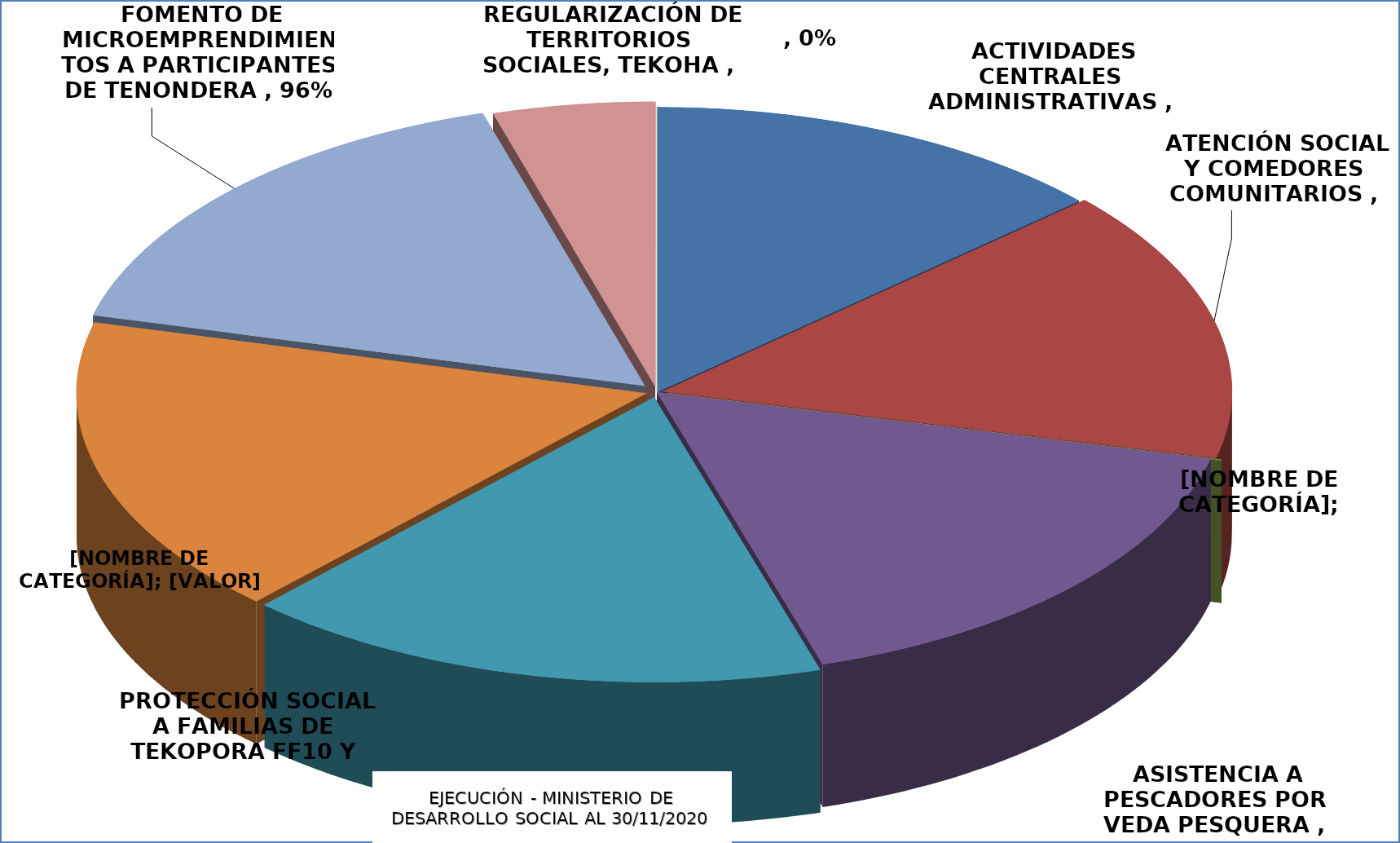
| Category | EJECUCIÓN - MINISTERIO DE DESARROLLO SOCIAL |
|---|---|
| ACTIVIDADES CENTRALES ADMINISTRATIVAS | 0.781 |
| ATENCIÓN SOCIAL Y COMEDORES COMUNITARIOS | 0.91 |
| ATENCIÓN SOCIAL Y COMEDORES COMUNITARIOS - OLLAS POPULARES -FF20 - OF 817 - COVID19 - ADICIONAL | 0 |
| ASISTENCIA A PESCADORES POR VEDA PESQUERA | 0.972 |
| PROTECCIÓN SOCIAL A FAMILIAS DE TEKOPORA FF10 Y FF20 | 0.982 |
| TRAN. MONETARIAS A FAMILIAS AFECTADAS POR COVID19- ADICIONAL | 1 |
| FOMENTO DE MICROEMPRENDIMIENTOS A PARTICIPANTES DE TENONDERA | 0.964 |
| REGULARIZACIÓN DE TERRITORIOS SOCIALES, TEKOHA | 0.27 |